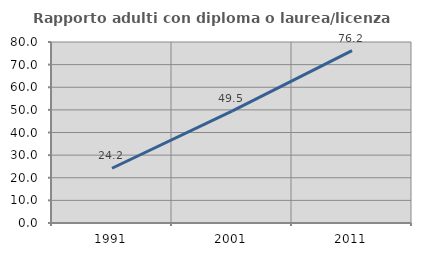
| Category | Rapporto adulti con diploma o laurea/licenza media  |
|---|---|
| 1991.0 | 24.197 |
| 2001.0 | 49.451 |
| 2011.0 | 76.164 |